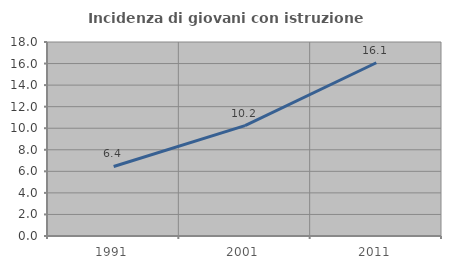
| Category | Incidenza di giovani con istruzione universitaria |
|---|---|
| 1991.0 | 6.449 |
| 2001.0 | 10.235 |
| 2011.0 | 16.075 |